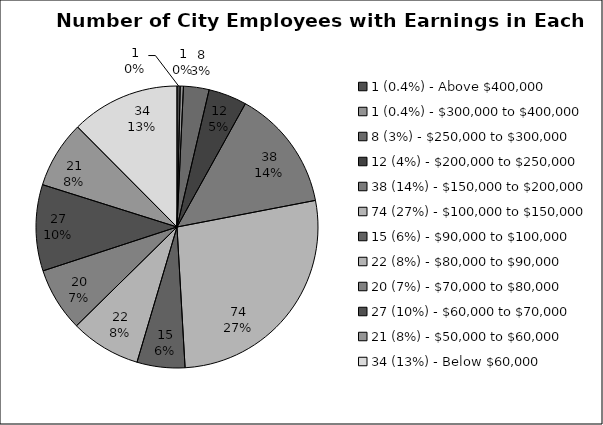
| Category | Count |
|---|---|
| 1 (0.4%) - Above $400,000 | 1 |
| 1 (0.4%) - $300,000 to $400,000 | 1 |
| 8 (3%) - $250,000 to $300,000 | 8 |
| 12 (4%) - $200,000 to $250,000 | 12 |
| 38 (14%) - $150,000 to $200,000 | 38 |
| 74 (27%) - $100,000 to $150,000 | 74 |
| 15 (6%) - $90,000 to $100,000 | 15 |
| 22 (8%) - $80,000 to $90,000 | 22 |
| 20 (7%) - $70,000 to $80,000 | 20 |
| 27 (10%) - $60,000 to $70,000 | 27 |
| 21 (8%) - $50,000 to $60,000 | 21 |
| 34 (13%) - Below $60,000 | 34 |